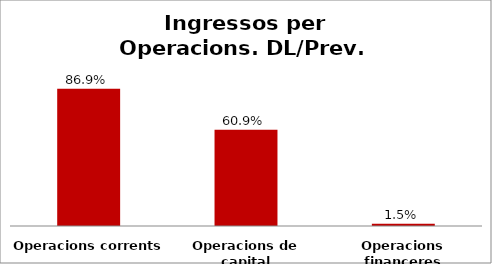
| Category | Series 0 |
|---|---|
| Operacions corrents | 0.869 |
| Operacions de capital | 0.609 |
| Operacions financeres | 0.015 |